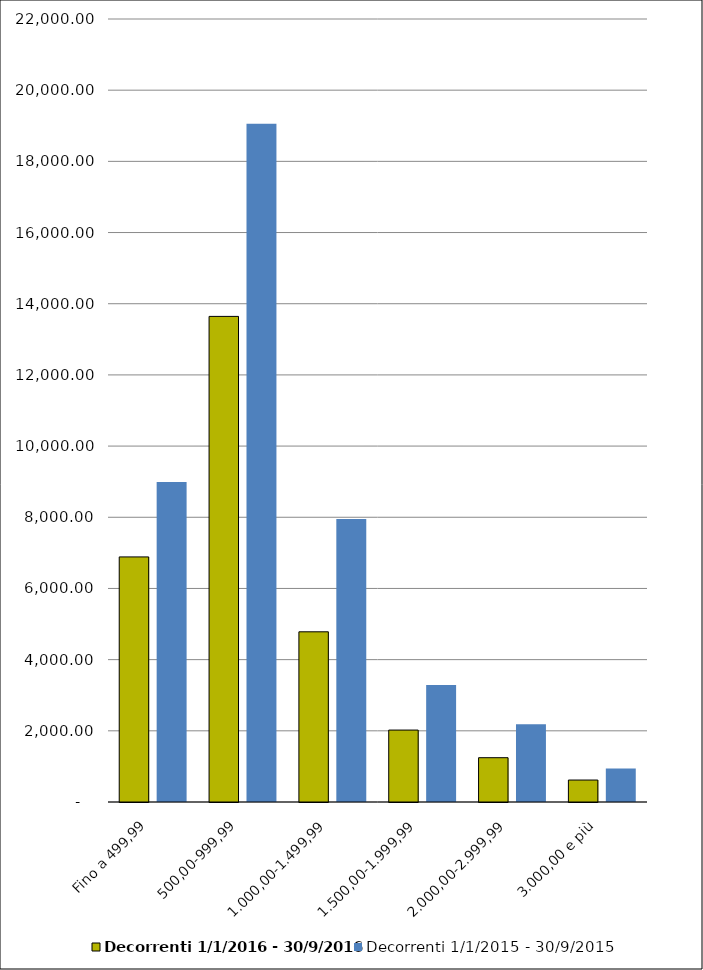
| Category | Decorrenti 1/1/2016 - 30/9/2016 | Decorrenti 1/1/2015 - 30/9/2015 |
|---|---|---|
| Fino a 499,99 | 6886 | 8992 |
| 500,00-999,99 | 13644 | 19059 |
| 1.000,00-1.499,99 | 4782 | 7949 |
| 1.500,00-1.999,99 | 2021 | 3290 |
| 2.000,00-2.999,99 | 1245 | 2183 |
| 3.000,00 e più | 617 | 941 |